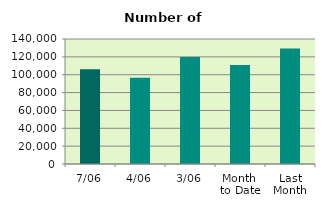
| Category | Series 0 |
|---|---|
| 7/06 | 106034 |
| 4/06 | 96540 |
| 3/06 | 119948 |
| Month 
to Date | 110990.8 |
| Last
Month | 129378.19 |